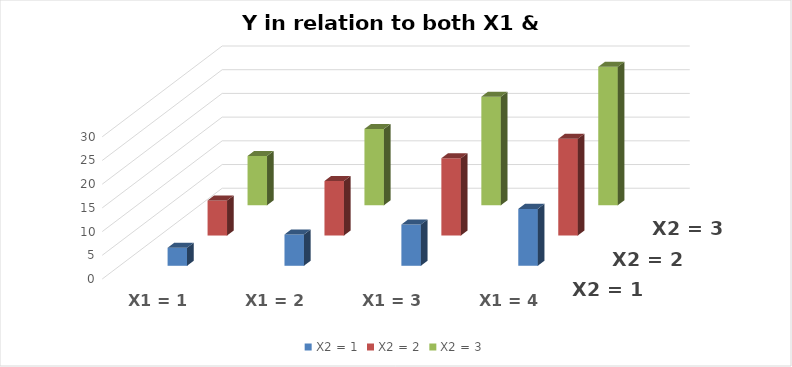
| Category | X2 = 1 | X2 = 2 | X2 = 3 |
|---|---|---|---|
| X1 = 1 | 3.8 | 7.4 | 10.4 |
| X1 = 2 | 6.6 | 11.5 | 16.1 |
| X1 = 3 | 8.7 | 16.3 | 22.9 |
| X1 = 4 | 12 | 20.4 | 29.2 |